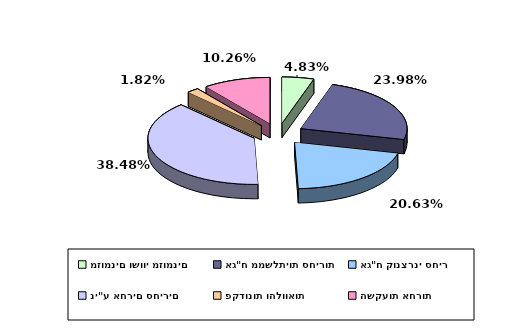
| Category | Series 0 |
|---|---|
| מזומנים ושווי מזומנים | 0.048 |
| אג"ח ממשלתיות סחירות | 0.24 |
| אג"ח קונצרני סחיר | 0.206 |
| ני"ע אחרים סחירים | 0.385 |
| פקדונות והלוואות | 0.018 |
| השקעות אחרות | 0.103 |